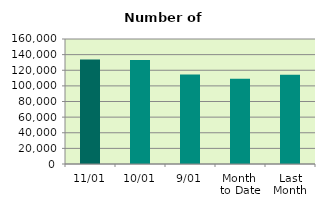
| Category | Series 0 |
|---|---|
| 11/01 | 133750 |
| 10/01 | 132988 |
| 9/01 | 114654 |
| Month 
to Date | 109095.5 |
| Last
Month | 114251.429 |